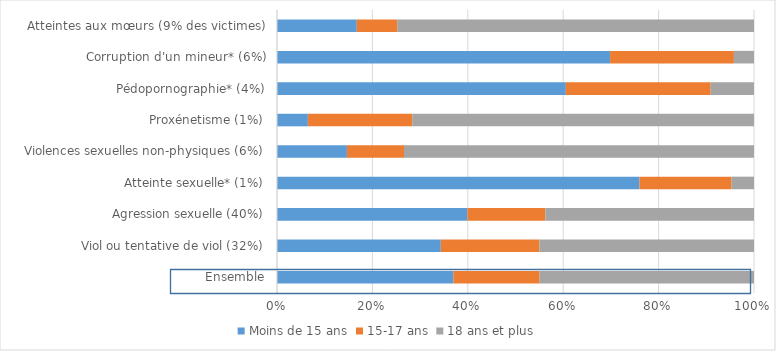
| Category | Moins de 15 ans | 15-17 ans | 18 ans et plus |
|---|---|---|---|
| Ensemble | 36.96 | 18.1 | 44.94 |
| Viol ou tentative de viol (32%) | 34.34 | 20.68 | 44.98 |
| Agression sexuelle (40%) | 39.94 | 16.32 | 43.74 |
| Atteinte sexuelle* (1%) | 75.99 | 19.33 | 4.69 |
|    Violences sexuelles non-physiques (6%) | 14.66 | 11.97 | 73.37 |
| Proxénetisme (1%) | 6.47 | 21.89 | 71.64 |
| Pédopornographie* (4%) | 60.55 | 30.36 | 9.08 |
| Corruption d'un mineur* (6%) | 69.83 | 25.96 | 4.21 |
|     Atteintes aux mœurs (9% des victimes) | 16.73 | 8.47 | 74.8 |